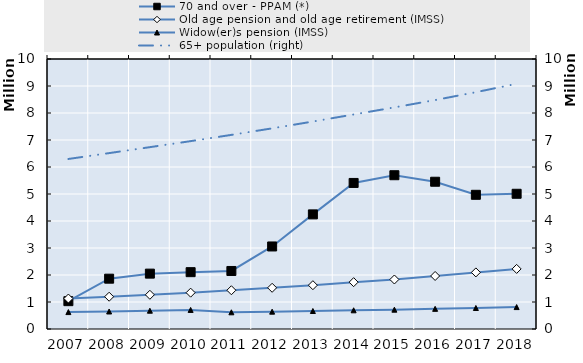
| Category | 70 and over - PPAM (*) | Old age pension and old age retirement (IMSS) |
|---|---|---|
| 2007.0 | 1031005 | 1127651 |
| 2008.0 | 1863945 | 1195461 |
| 2009.0 | 2050626 | 1267083 |
| 2010.0 | 2105306 | 1345740 |
| 2011.0 | 2149024 | 1435730 |
| 2012.0 | 3056816 | 1526148 |
| 2013.0 | 4245266 | 1622484 |
| 2014.0 | 5409399 | 1734697 |
| 2015.0 | 5695467 | 1833645 |
| 2016.0 | 5453775 | 1963556 |
| 2017.0 | 4970221 | 2096033 |
| 2018.0 | 5008306 | 2225741 |